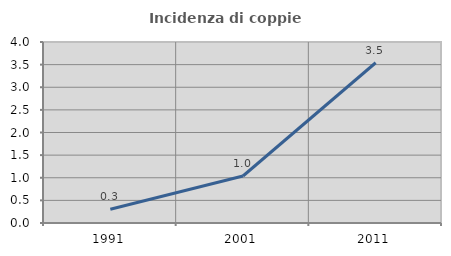
| Category | Incidenza di coppie miste |
|---|---|
| 1991.0 | 0.303 |
| 2001.0 | 1.039 |
| 2011.0 | 3.542 |